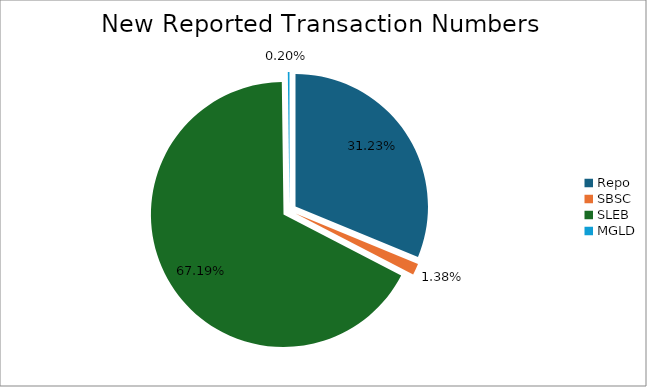
| Category | Series 0 |
|---|---|
| Repo | 473767 |
| SBSC | 20874 |
| SLEB | 1019484 |
| MGLD | 3102 |